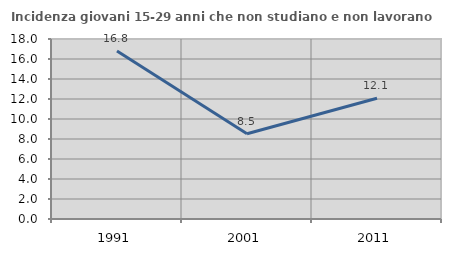
| Category | Incidenza giovani 15-29 anni che non studiano e non lavorano  |
|---|---|
| 1991.0 | 16.8 |
| 2001.0 | 8.527 |
| 2011.0 | 12.075 |